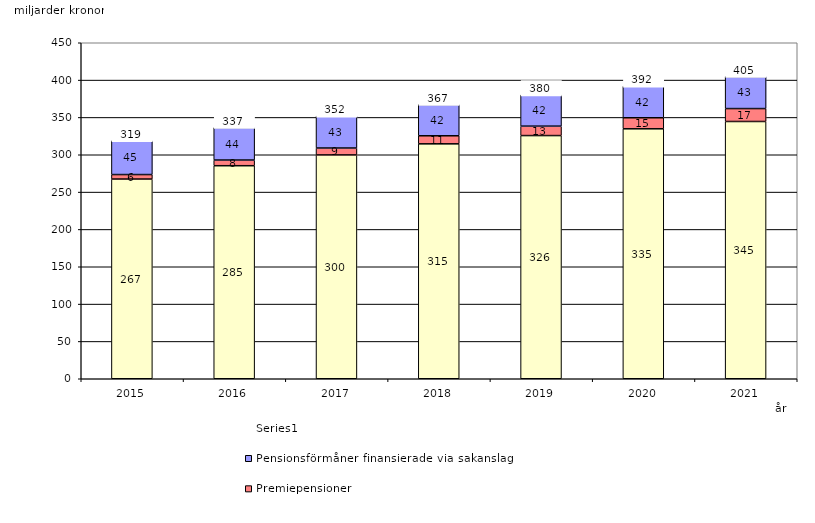
| Category | Inkomstpension och tilläggspension m.m. | Premiepensioner | Pensionsförmåner finansierade via sakanslag | Series 0 |
|---|---|---|---|---|
| 2015.0 | 267.466 | 6.008 | 45.361 | 20 |
| 2016.0 | 285.327 | 7.6 | 43.579 | 20 |
| 2017.0 | 299.785 | 9.246 | 42.685 | 20 |
| 2018.0 | 314.609 | 10.808 | 41.862 | 20 |
| 2019.0 | 325.681 | 12.624 | 41.814 | 20 |
| 2020.0 | 334.77 | 14.771 | 42.315 | 20 |
| 2021.0 | 344.534 | 17.322 | 42.878 | 20 |